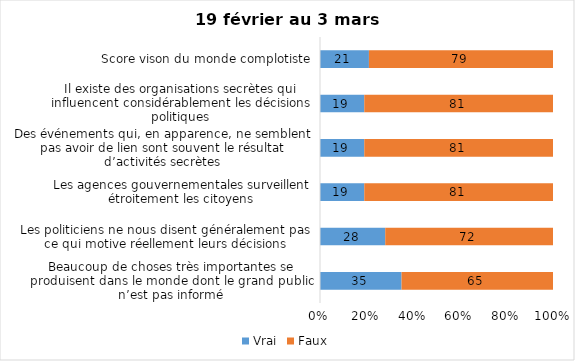
| Category | Vrai | Faux |
|---|---|---|
| Beaucoup de choses très importantes se produisent dans le monde dont le grand public n’est pas informé | 35 | 65 |
| Les politiciens ne nous disent généralement pas ce qui motive réellement leurs décisions | 28 | 72 |
| Les agences gouvernementales surveillent étroitement les citoyens | 19 | 81 |
| Des événements qui, en apparence, ne semblent pas avoir de lien sont souvent le résultat d’activités secrètes | 19 | 81 |
| Il existe des organisations secrètes qui influencent considérablement les décisions politiques | 19 | 81 |
| Score vison du monde complotiste | 21 | 79 |